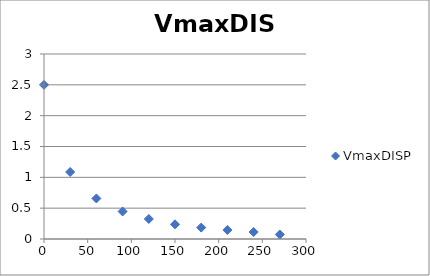
| Category | VmaxDISP |
|---|---|
| 0.0 | 2.5 |
| 30.0 | 1.087 |
| 60.0 | 0.658 |
| 90.0 | 0.446 |
| 120.0 | 0.325 |
| 150.0 | 0.238 |
| 180.0 | 0.185 |
| 210.0 | 0.146 |
| 240.0 | 0.113 |
| 270.0 | 0.073 |